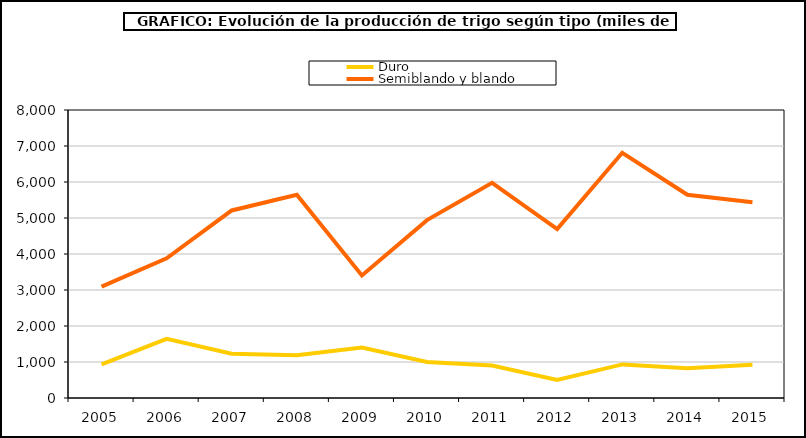
| Category | Duro | Semiblando y blando |
|---|---|---|
| 2005 | 934.523 | 3092.171 |
| 2006 | 1643.214 | 3878.368 |
| 2007 | 1227.124 | 5209.235 |
| 2008 | 1184.844 | 5646.617 |
| 2009 | 1401.499 | 3403.273 |
| 2010 | 999.861 | 4941.336 |
| 2011 | 900.352 | 5976.299 |
| 2012 | 499.493 | 4690.335 |
| 2013 | 933.268 | 6811.661 |
| 2014 | 825.433 | 5647.301 |
| 2015 | 924.956 | 5437.736 |